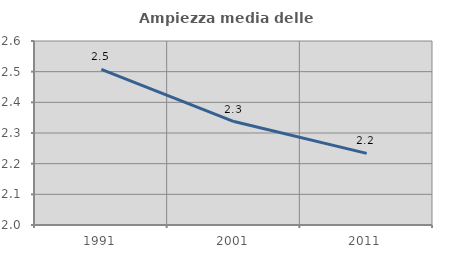
| Category | Ampiezza media delle famiglie |
|---|---|
| 1991.0 | 2.508 |
| 2001.0 | 2.337 |
| 2011.0 | 2.234 |